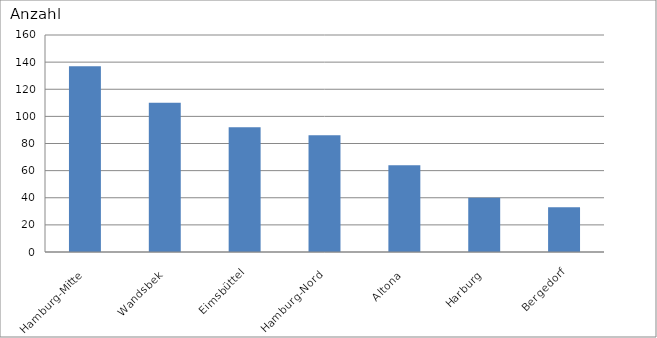
| Category | Hamburg-Mitte Wandsbek Eimsbüttel Hamburg-Nord Altona Harburg Bergedorf |
|---|---|
| Hamburg-Mitte | 137 |
| Wandsbek | 110 |
| Eimsbüttel | 92 |
| Hamburg-Nord | 86 |
| Altona | 64 |
| Harburg | 40 |
| Bergedorf | 33 |